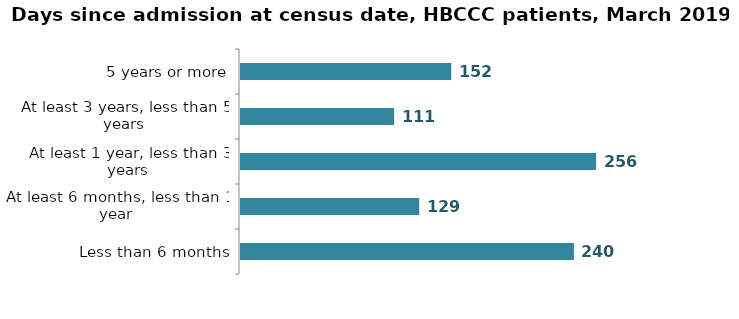
| Category | Series 4 |
|---|---|
| Less than 6 months | 240 |
| At least 6 months, less than 1 year | 129 |
| At least 1 year, less than 3 years | 256 |
| At least 3 years, less than 5 years | 111 |
| 5 years or more | 152 |